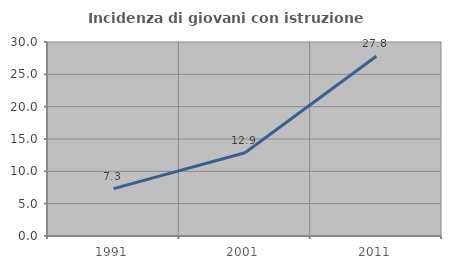
| Category | Incidenza di giovani con istruzione universitaria |
|---|---|
| 1991.0 | 7.324 |
| 2001.0 | 12.879 |
| 2011.0 | 27.807 |